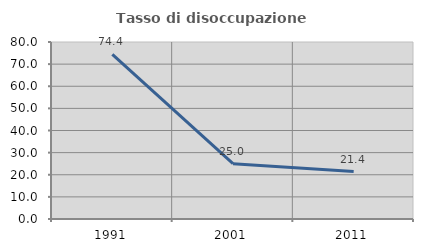
| Category | Tasso di disoccupazione giovanile  |
|---|---|
| 1991.0 | 74.359 |
| 2001.0 | 25 |
| 2011.0 | 21.429 |